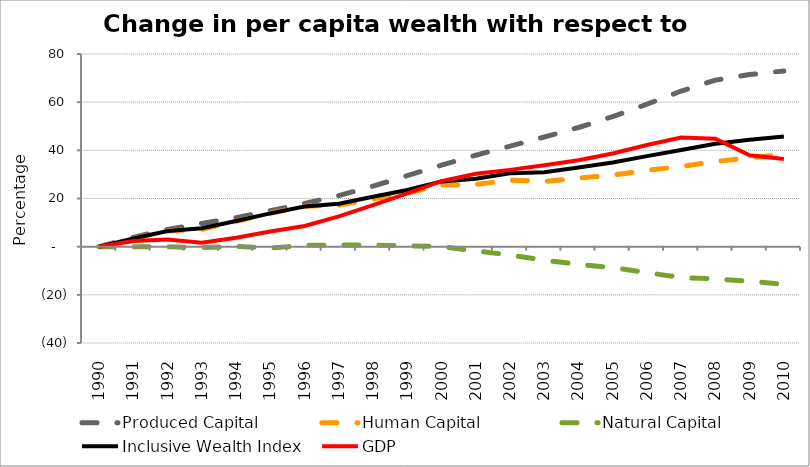
| Category | Produced Capital  | Human Capital | Natural Capital | Inclusive Wealth Index | GDP |
|---|---|---|---|---|---|
| 1990.0 | 0 | 0 | 0 | 0 | 0 |
| 1991.0 | 3.872 | 3.314 | -0.015 | 3.376 | 2.309 |
| 1992.0 | 7.181 | 6.525 | -0.051 | 6.535 | 2.977 |
| 1993.0 | 9.615 | 7.191 | -0.383 | 7.623 | 1.61 |
| 1994.0 | 12.058 | 10.51 | 0.112 | 10.655 | 3.727 |
| 1995.0 | 14.948 | 13.88 | -0.587 | 13.808 | 6.295 |
| 1996.0 | 17.94 | 16.794 | 0.526 | 16.7 | 8.609 |
| 1997.0 | 21.193 | 17.191 | 0.669 | 17.81 | 12.556 |
| 1998.0 | 25.106 | 19.822 | 0.679 | 20.702 | 17.215 |
| 1999.0 | 29.482 | 22.235 | 0.329 | 23.545 | 22.117 |
| 2000.0 | 33.855 | 25.621 | 0.006 | 27.092 | 27.203 |
| 2001.0 | 37.97 | 25.807 | -1.753 | 28.222 | 30.295 |
| 2002.0 | 41.724 | 27.622 | -3.47 | 30.443 | 31.885 |
| 2003.0 | 45.521 | 27.065 | -5.604 | 30.945 | 33.785 |
| 2004.0 | 49.479 | 28.462 | -7.372 | 32.912 | 35.918 |
| 2005.0 | 53.998 | 29.749 | -8.695 | 34.952 | 38.677 |
| 2006.0 | 59.161 | 31.676 | -10.784 | 37.6 | 42.211 |
| 2007.0 | 64.62 | 33.309 | -12.828 | 40.11 | 45.357 |
| 2008.0 | 69.156 | 35.369 | -13.382 | 42.732 | 44.847 |
| 2009.0 | 71.463 | 36.889 | -14.356 | 44.391 | 37.952 |
| 2010.0 | 72.946 | 38.266 | -15.634 | 45.733 | 36.442 |